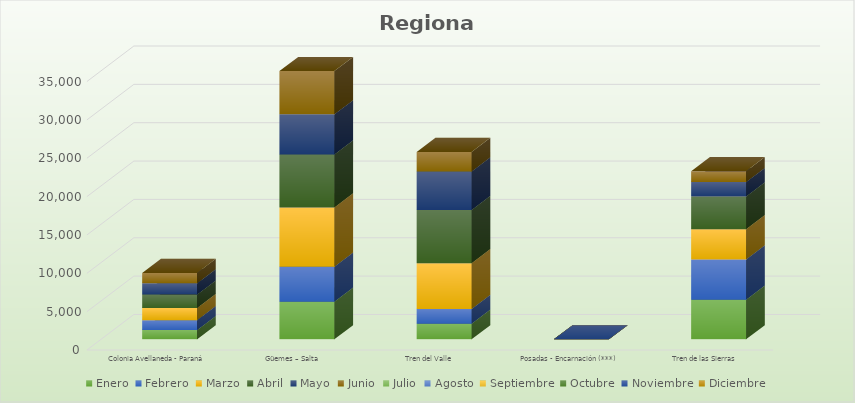
| Category | Enero | Febrero | Marzo | Abril | Mayo | Junio | Julio | Agosto | Septiembre | Octubre | Noviembre | Diciembre |
|---|---|---|---|---|---|---|---|---|---|---|---|---|
| Colonia Avellaneda - Paraná | 1204 | 1298 | 1578 | 1750 | 1479 | 1350 |  |  |  |  |  |  |
| Güemes – Salta | 4916 | 4539 | 7745 | 6891 | 5237 | 5641 |  |  |  |  |  |  |
| Tren del Valle | 2047 | 1901 | 5975 | 6945 | 5011 | 2557 |  |  |  |  |  |  |
| Posadas - Encarnación (***) | 0 | 0 | 0 | 0 | 0 | 0 |  |  |  |  |  |  |
| Tren de las Sierras | 5164 | 5258 | 3920 | 4283 | 1875 | 1415 |  |  |  |  |  |  |